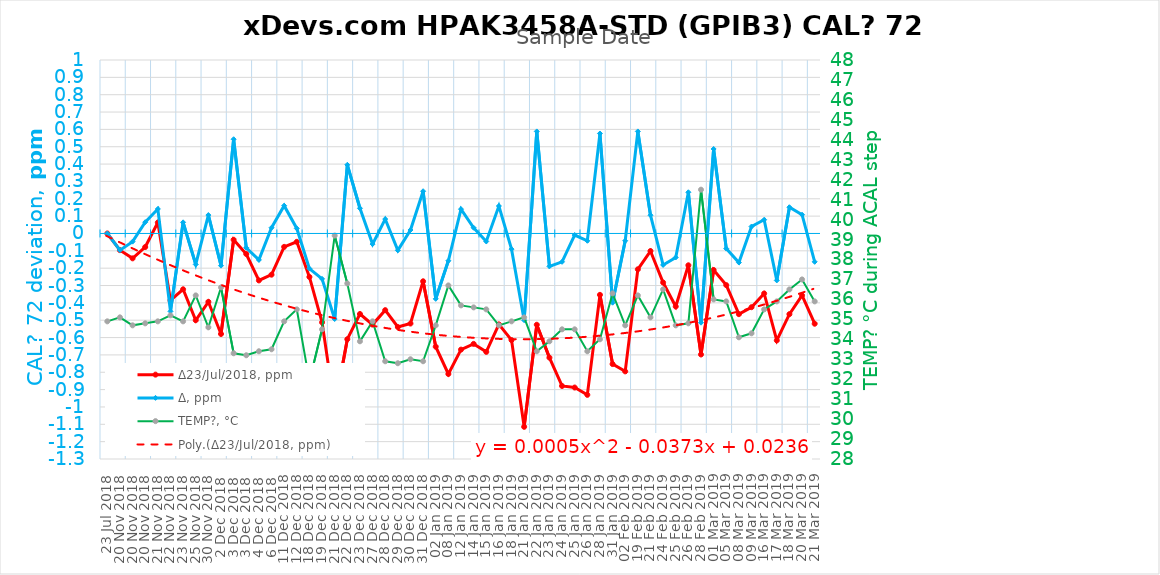
| Category | Δ23/Jul/2018, ppm | Δ, ppm |
|---|---|---|
| 23 Jul 2018 | 0 | 0 |
| 20 Nov 2018 | -0.096 | -0.096 |
| 20 Nov 2018 | -0.143 | -0.047 |
| 20 Nov 2018 | -0.078 | 0.065 |
| 21 Nov 2018 | 0.063 | 0.141 |
| 22 Nov 2018 | -0.386 | -0.449 |
| 23 Nov 2018 | -0.322 | 0.064 |
| 25 Nov 2018 | -0.5 | -0.178 |
| 30 Nov 2018 | -0.394 | 0.106 |
| 2 Dec 2018  | -0.579 | -0.185 |
| 3 Dec 2018  | -0.036 | 0.543 |
| 3 Dec 2018  | -0.118 | -0.082 |
| 4 Dec 2018  | -0.271 | -0.152 |
| 6 Dec 2018  | -0.238 | 0.033 |
| 11 Dec 2018 | -0.077 | 0.16 |
| 12 Dec 2018 | -0.048 | 0.029 |
| 18 Dec 2018 | -0.251 | -0.202 |
| 19 Dec 2018 | -0.512 | -0.262 |
| 21 Dec 2018 | -1.005 | -0.493 |
| 22 Dec 2018 | -0.609 | 0.396 |
| 23 Dec 2018 | -0.464 | 0.145 |
| 27 Dec 2018 | -0.525 | -0.061 |
| 28 Dec 2018 | -0.442 | 0.083 |
| 29 Dec 2018 | -0.539 | -0.097 |
| 30 Dec 2018 | -0.519 | 0.02 |
| 31 Dec 2018 | -0.276 | 0.244 |
| 02 Jan 2019 | -0.652 | -0.377 |
| 08 Jan 2019 | -0.81 | -0.157 |
| 12 Jan 2019 | -0.67 | 0.14 |
| 14 Jan 2019 | -0.636 | 0.033 |
| 15 Jan 2019 | -0.683 | -0.046 |
| 16 Jan 2019 | -0.524 | 0.158 |
| 18 Jan 2019 | -0.614 | -0.09 |
| 21 Jan 2019 | -1.115 | -0.5 |
| 22 Jan 2019 | -0.526 | 0.588 |
| 23 Jan 2019 | -0.716 | -0.189 |
| 24 Jan 2019 | -0.879 | -0.163 |
| 25 Jan 2019 | -0.888 | -0.009 |
| 26 Jan 2019 | -0.93 | -0.042 |
| 28 Jan 2019 | -0.354 | 0.576 |
| 31 Jan 2019 | -0.753 | -0.399 |
| 02 Feb 2019 | -0.795 | -0.042 |
| 19 Feb 2019 | -0.206 | 0.588 |
| 21 Feb 2019 | -0.101 | 0.105 |
| 24 Feb 2019 | -0.283 | -0.181 |
| 25 Feb 2019 | -0.421 | -0.138 |
| 26 Feb 2019 | -0.183 | 0.238 |
| 28 Feb 2019 | -0.698 | -0.514 |
| 01 Mar 2019 | -0.21 | 0.487 |
| 05 Mar 2019 | -0.298 | -0.087 |
| 08 Mar 2019 | -0.465 | -0.167 |
| 09 Mar 2019 | -0.425 | 0.04 |
| 16 Mar 2019 | -0.346 | 0.079 |
| 17 Mar 2019 | -0.616 | -0.271 |
| 18 Mar 2019 | -0.465 | 0.151 |
| 20 Mar 2019 | -0.357 | 0.108 |
| 21 Mar 2019 | -0.52 | -0.163 |